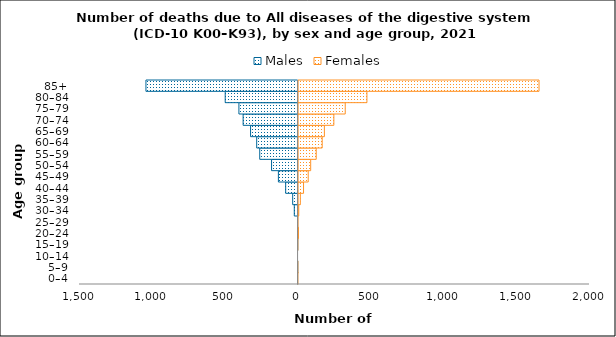
| Category | Males | Females |
|---|---|---|
| 0–4 | -3 | 1 |
| 5–9 | -1 | 1 |
| 10–14 | 0 | 0 |
| 15–19 | -1 | 1 |
| 20–24 | -3 | 6 |
| 25–29 | -3 | 3 |
| 30–34 | -26 | 8 |
| 35–39 | -37 | 19 |
| 40–44 | -85 | 41 |
| 45–49 | -135 | 73 |
| 50–54 | -182 | 90 |
| 55–59 | -263 | 128 |
| 60–64 | -284 | 169 |
| 65–69 | -326 | 184 |
| 70–74 | -377 | 249 |
| 75–79 | -406 | 327 |
| 80–84 | -500 | 476 |
| 85+ | -1044 | 1657 |